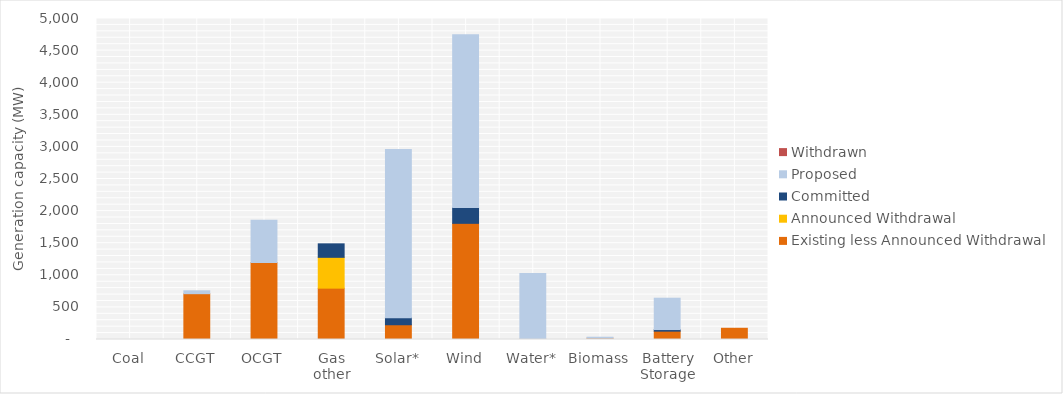
| Category | Existing less Announced Withdrawal | Announced Withdrawal | Committed | Proposed | Withdrawn |
|---|---|---|---|---|---|
| Coal | 0 | 0 | 0 | 0 | 0 |
| CCGT | 713.5 | 0 | 0 | 45 | 0 |
| OCGT | 1198.04 | 0 | 0 | 659 | 0 |
| Gas other | 800 | 480 | 210 | 0 | 0 |
| Solar* | 229.618 | 0 | 110 | 2619.5 | 0 |
| Wind | 1809.45 | 0 | 245.4 | 2693.8 | 0 |
| Water* | 3.85 | 0 | 0 | 1025 | 0 |
| Biomass | 20.473 | 0 | 0 | 15 | 0 |
| Battery Storage | 130 | 0 | 25 | 488 | 0 |
| Other | 174.698 | 0 | 0 | 0 | 0 |